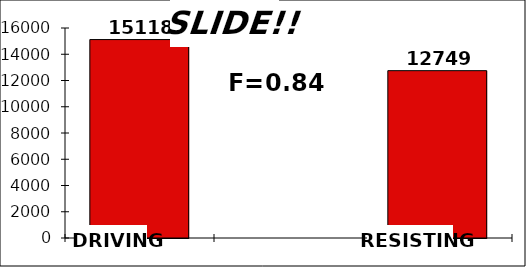
| Category | Series 0 |
|---|---|
| 0 | 15118.365 |
| 1 | 0 |
| 2 | 12749.116 |